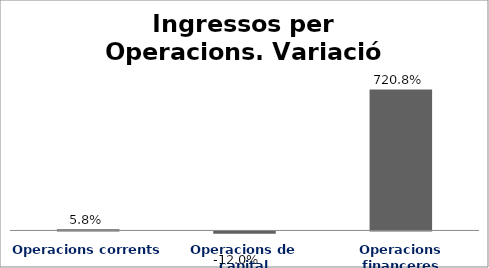
| Category | Series 0 |
|---|---|
| Operacions corrents | 0.058 |
| Operacions de capital | -0.12 |
| Operacions financeres | 7.208 |